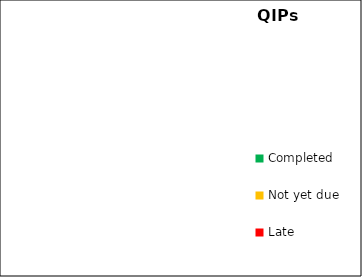
| Category | Series 0 |
|---|---|
| Completed | 0 |
| Not yet due | 0 |
| Late | 0 |